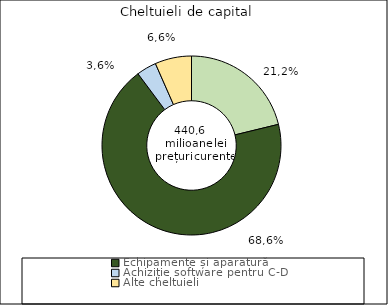
| Category | Series 0 |
|---|---|
| Terenuri și construcții | 0.212 |
| Echipamente și aparatură | 0.686 |
| Achiziție software pentru C-D | 0.036 |
| Alte cheltuieli | 0.066 |